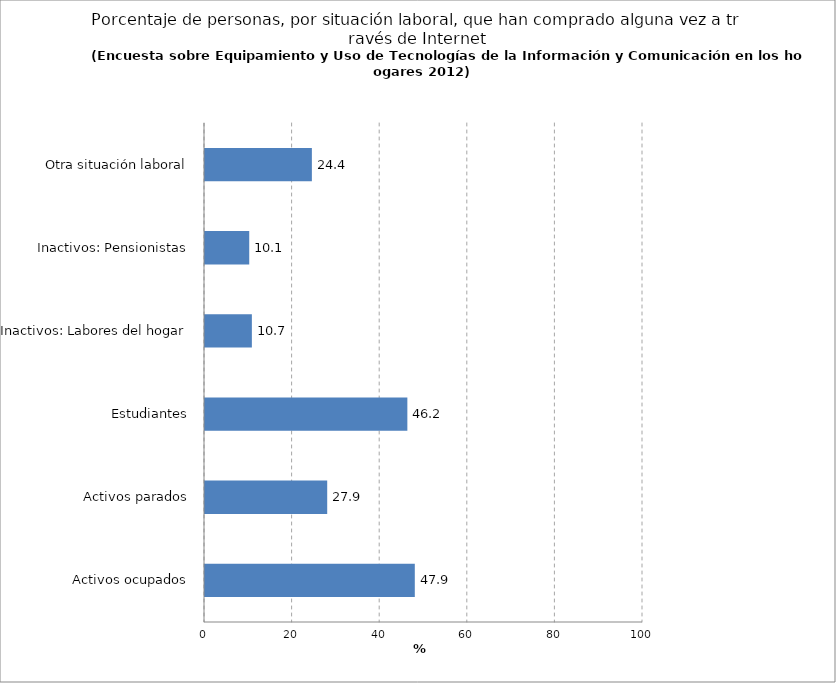
| Category | % |
|---|---|
| Activos ocupados | 47.9 |
| Activos parados | 27.9 |
|  Estudiantes | 46.2 |
| Inactivos: Labores del hogar | 10.7 |
|  Inactivos: Pensionistas | 10.1 |
|  Otra situación laboral | 24.4 |